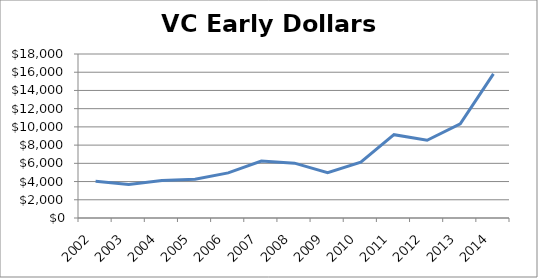
| Category | Early Dollars |
|---|---|
| 2002.0 | 4041.939 |
| 2003.0 | 3665.818 |
| 2004.0 | 4109.294 |
| 2005.0 | 4254.033 |
| 2006.0 | 4949.315 |
| 2007.0 | 6242.858 |
| 2008.0 | 6021.088 |
| 2009.0 | 4969.37 |
| 2010.0 | 6136.292 |
| 2011.0 | 9141.353 |
| 2012.0 | 8529.928 |
| 2013.0 | 10345.425 |
| 2014.0 | 15825.086 |